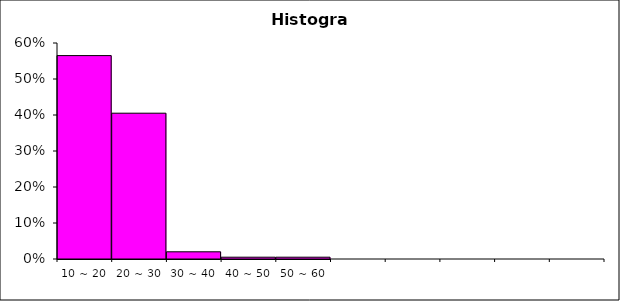
| Category | Freq |
|---|---|
| 10 ~ 20 | 0.565 |
| 20 ~ 30 | 0.405 |
| 30 ~ 40 | 0.02 |
| 40 ~ 50 | 0.005 |
| 50 ~ 60 | 0.005 |